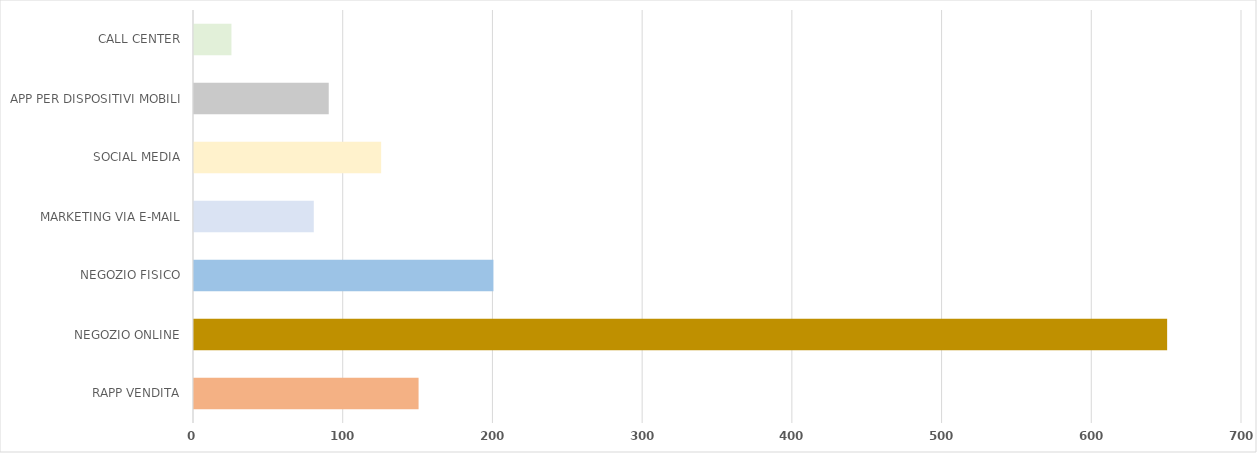
| Category | Series 0 |
|---|---|
| RAPP VENDITA | 150 |
| NEGOZIO ONLINE | 650 |
| NEGOZIO FISICO | 200 |
| MARKETING VIA E-MAIL | 80 |
| SOCIAL MEDIA | 125 |
| APP PER DISPOSITIVI MOBILI | 90 |
| CALL CENTER | 25 |